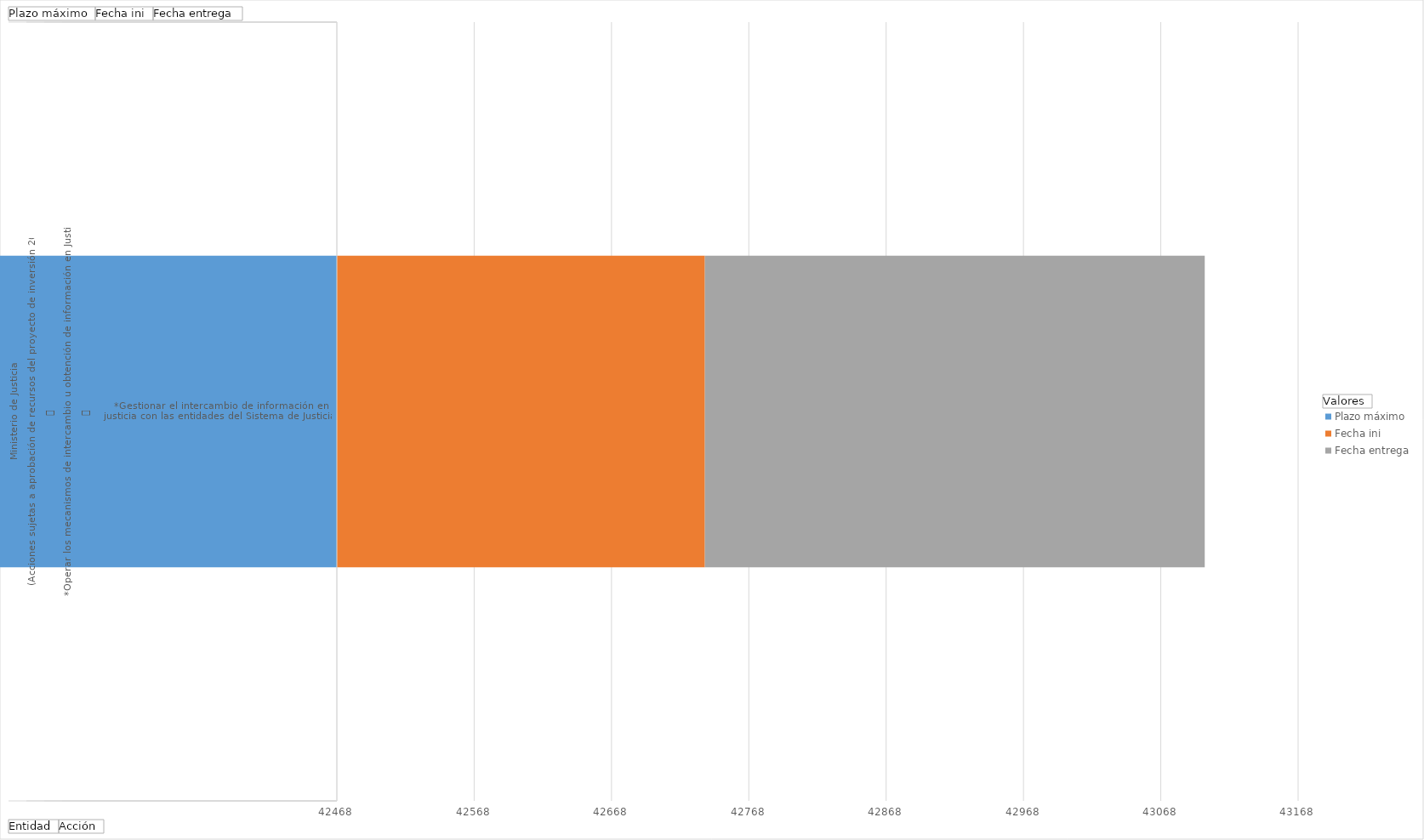
| Category | Plazo máximo | Fecha ini | Fecha entrega |
|---|---|---|---|
| 0 | -452 | 1/1/17 | 364 |